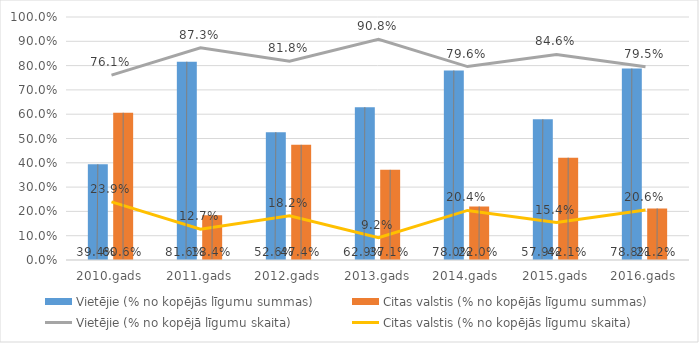
| Category | Vietējie (% no kopējās līgumu summas) | Citas valstis (% no kopējās līgumu summas) |
|---|---|---|
| 2010.gads | 0.394 | 0.606 |
| 2011.gads | 0.816 | 0.184 |
| 2012.gads | 0.526 | 0.474 |
| 2013.gads | 0.629 | 0.371 |
| 2014.gads | 0.78 | 0.22 |
| 2015.gads | 0.579 | 0.421 |
| 2016.gads | 0.788 | 0.212 |